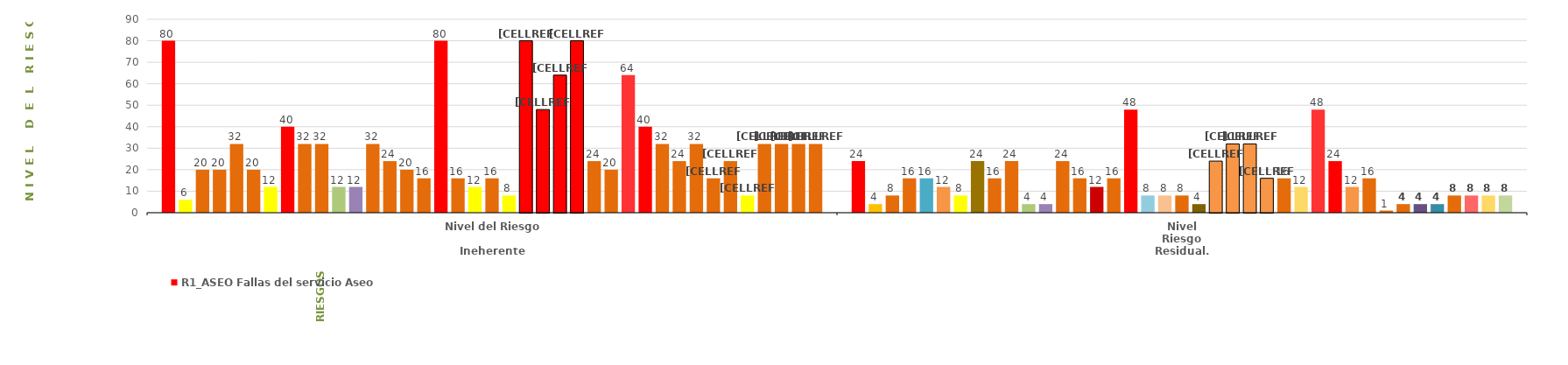
| Category | R1_ASEO | R2_ASEO | R1_TIC´s | R2_TIC´s | R3_TIC´s | R1_DOC | R2_DOC | R3_DOC | R1_ALU | R2_ALU | SIG | MIPG | R1_JUR | R2_JUR | R1_ACT | R2_ACT | R1_COM | R1_CH | R2_CH | R3_CH | R4_CH |
|---|---|---|---|---|---|---|---|---|---|---|---|---|---|---|---|---|---|---|---|---|---|
| Nivel del Riesgo 
Ineherente | 80 | 6 | 20 | 20 | 32 | 20 | 12 | 40 | 32 | 32 | 12 | 12 | 32 | 24 | 20 | 16 | 80 | 16 | 12 | 16 | 8 |
| Nivel
Riesgo
Residual. | 24 | 4 | 8 | 16 | 16 | 12 | 8 | 24 | 16 | 24 | 4 | 4 | 24 | 16 | 12 | 16 | 48 | 8 | 8 | 8 | 4 |